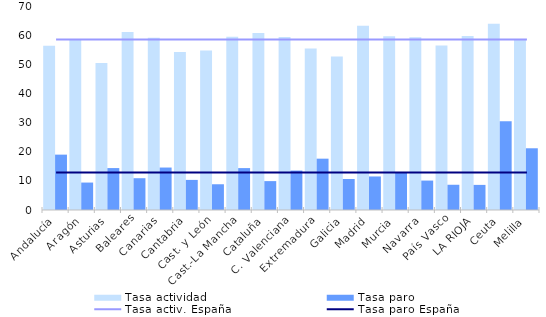
| Category | Tasa actividad | Tasa paro |
|---|---|---|
| Andalucía | 56.398 | 18.999 |
| Aragón | 58.404 | 9.417 |
| Asturias | 50.447 | 14.388 |
| Baleares | 61.054 | 10.91 |
| Canarias | 59.095 | 14.571 |
| Cantabria | 54.257 | 10.327 |
| Cast. y León | 54.738 | 8.835 |
| Cast.-La Mancha | 59.455 | 14.378 |
| Cataluña | 60.695 | 9.912 |
| C. Valenciana | 59.38 | 13.532 |
| Extremadura | 55.433 | 17.614 |
| Galicia | 52.69 | 10.632 |
| Madrid | 63.206 | 11.507 |
| Murcia | 59.654 | 12.896 |
| Navarra | 59.319 | 10.095 |
| País Vasco | 56.474 | 8.66 |
| LA RIOJA | 59.707 | 8.616 |
| Ceuta | 63.927 | 30.476 |
| Melilla | 58.648 | 21.18 |